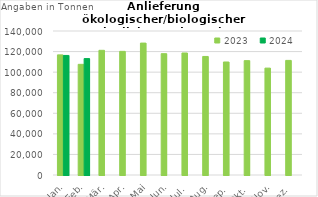
| Category | 2023 | 2024 |
|---|---|---|
| Jan. | 116779.33 | 116227.873 |
| Feb. | 107594.545 | 113176.246 |
| Mär. | 121212.435 | 0 |
| Apr. | 120208.989 | 0 |
| Mai | 128253.711 | 0 |
| Jun. | 117942.851 | 0 |
| Jul. | 118612.122 | 0 |
| Aug. | 115248.086 | 0 |
| Sep. | 109871.811 | 0 |
| Okt. | 111178.903 | 0 |
| Nov. | 103910.089 | 0 |
| Dez. | 111419.496 | 0 |